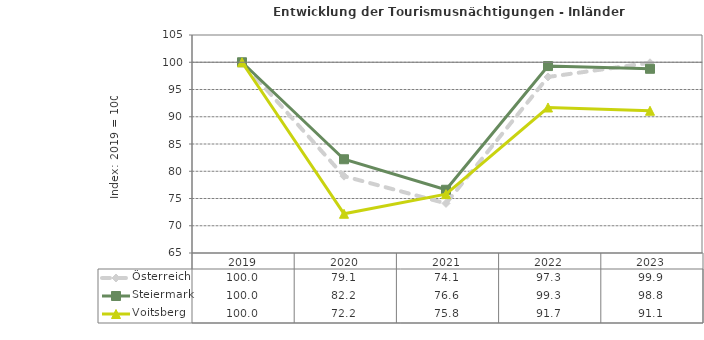
| Category | Österreich | Steiermark | Voitsberg |
|---|---|---|---|
| 2023.0 | 99.9 | 98.8 | 91.1 |
| 2022.0 | 97.3 | 99.3 | 91.7 |
| 2021.0 | 74.1 | 76.6 | 75.8 |
| 2020.0 | 79.1 | 82.2 | 72.2 |
| 2019.0 | 100 | 100 | 100 |